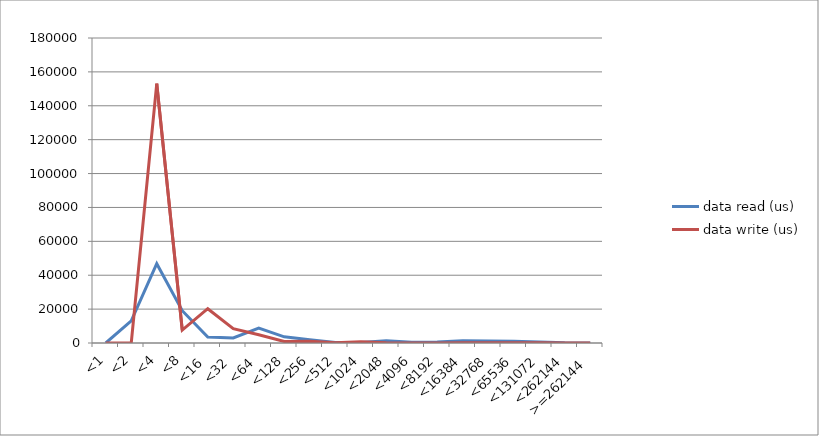
| Category | data read (us) | data write (us) |
|---|---|---|
| <1 | 0 | 0 |
| <2 | 13067 | 0 |
| <4 | 46803 | 153106 |
| <8 | 19069 | 7617 |
| <16 | 3504 | 20240 |
| <32 | 2988 | 8503 |
| <64 | 8768 | 4841 |
| <128 | 3641 | 918 |
| <256 | 1980 | 1012 |
| <512 | 367 | 189 |
| <1024 | 366 | 757 |
| <2048 | 1337 | 169 |
| <4096 | 394 | 44 |
| <8192 | 617 | 63 |
| <16384 | 1401 | 155 |
| <32768 | 1243 | 103 |
| <65536 | 1062 | 151 |
| <131072 | 641 | 169 |
| <262144 | 89 | 19 |
| >=262144 | 13 | 0 |